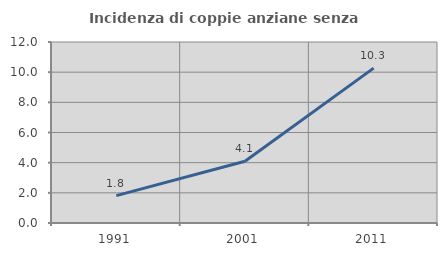
| Category | Incidenza di coppie anziane senza figli  |
|---|---|
| 1991.0 | 1.812 |
| 2001.0 | 4.096 |
| 2011.0 | 10.27 |